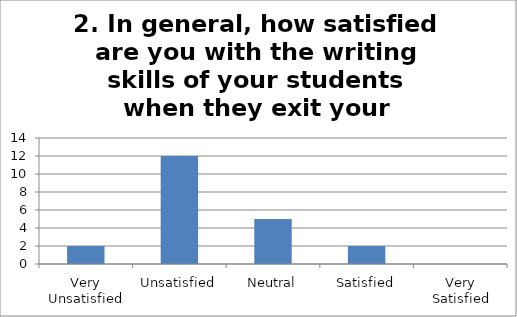
| Category | 2. In general, how satisfied are you with the writing skills of your students when they exit your course? Responses |
|---|---|
| Very Unsatisfied | 2 |
| Unsatisfied | 12 |
| Neutral | 5 |
| Satisfied | 2 |
| Very Satisfied | 0 |